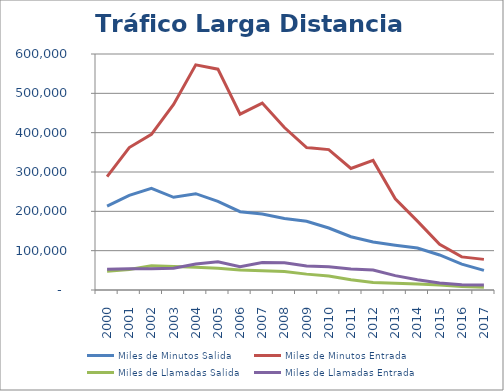
| Category | Miles de Minutos Salida  | Miles de Minutos Entrada | Miles de Llamadas Salida  | Miles de Llamadas Entrada |
|---|---|---|---|---|
| 2000 | 213111.889 | 288388.125 | 47935.313 | 52952.484 |
| 2001 | 240624.31 | 362105.965 | 51890.32 | 54050.474 |
| 2002 | 258263.207 | 395584.068 | 61696.706 | 53755.419 |
| 2003 | 235632.811 | 471710.26 | 59645.256 | 55151.805 |
| 2004 | 244879.421 | 572384.671 | 57875.109 | 66165.546 |
| 2005 | 225481.003 | 561441.7 | 55265.499 | 71975.899 |
| 2006 | 199057.012 | 447154.99 | 51113.174 | 58982.629 |
| 2007 | 193031.5 | 475329.384 | 48858.076 | 69933.935 |
| 2008 | 181903.703 | 413059.388 | 46744.176 | 69543.737 |
| 2009 | 174879.763 | 362075.623 | 40361.941 | 61194.621 |
| 2010 | 157654.648 | 357007.697 | 35316.058 | 59359.736 |
| 2011 | 135339.983 | 308905.292 | 26149.205 | 53691.514 |
| 2012 | 122043.466 | 329431.656 | 19101.011 | 50924.858 |
| 2013 | 114017.404 | 231797.265 | 17114.809 | 36575.406 |
| 2014 | 106668.68 | 175029.52 | 14990.781 | 25922.441 |
| 2015 | 89068.424 | 116143.021 | 12805.823 | 17673.903 |
| 2016 | 65918.92 | 84198.464 | 9191.072 | 13242.616 |
| 2017 | 49870.641 | 77843.799 | 7080.087 | 12633.004 |